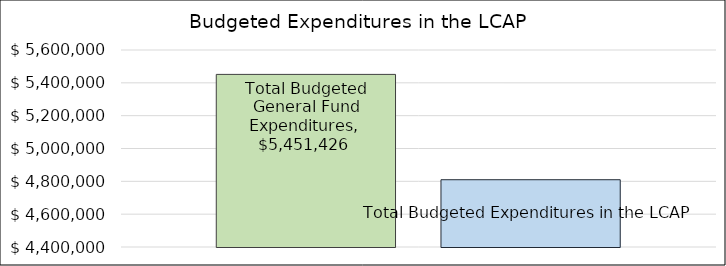
| Category | Total Budgeted General Fund Expenditures | Total Budgeted Expenditures in the LCAP |
|---|---|---|
| 0 | 5451426 | 4809804 |